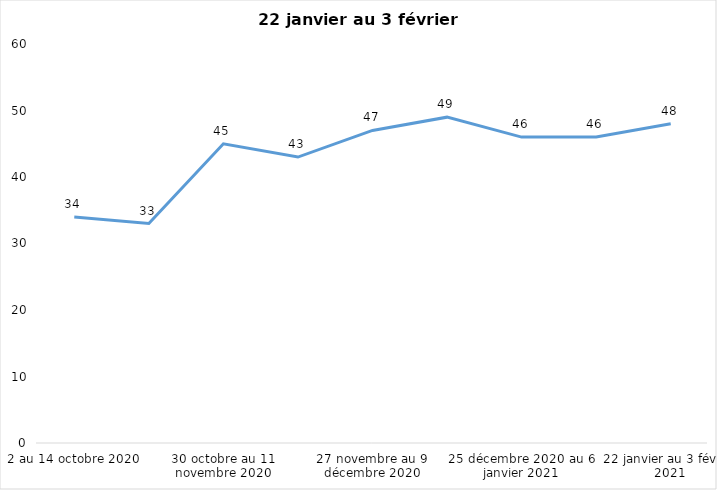
| Category | Toujours aux trois mesures |
|---|---|
| 2 au 14 octobre 2020 | 34 |
| 16 au 28 octobre 2020 | 33 |
| 30 octobre au 11 novembre 2020 | 45 |
| 13 au 25 novembre 2020 | 43 |
| 27 novembre au 9 décembre 2020 | 47 |
| 11 au 25 décembre 2020 | 49 |
| 25 décembre 2020 au 6 janvier 2021 | 46 |
| 8 au 20 janvier 2021 | 46 |
| 22 janvier au 3 février 2021 | 48 |